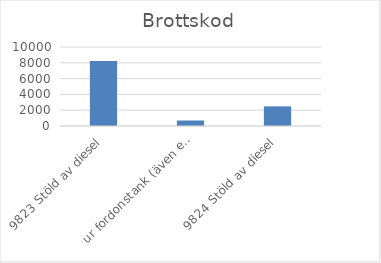
| Category | Summa |
|---|---|
| 9823 Stöld av diesel, ur fordonstank (även entreprenadmaskin m.m.) | 8231 |
| 9824 Stöld av diesel, ur större tankar (ej kopplade till fordon) | 697 |
| 9825 Stöld av drivmedel (även diesel), ej genom smitning | 2483 |